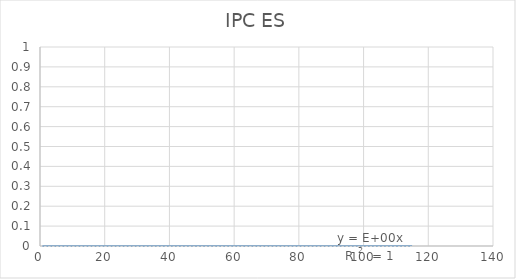
| Category | Series 0 |
|---|---|
| 1.0 | 99.81 |
| 2.0 | 99.95 |
| 3.0 | 100.72 |
| 4.0 | 100.55 |
| 5.0 | 100.61 |
| 6.0 | 100.79 |
| 7.0 | 100.63 |
| 8.0 | 100.4 |
| 9.0 | 100.2 |
| 10.0 | 99.46 |
| 11.0 | 99.06 |
| 12.0 | 100 |
| 13.0 | 100.44 |
| 14.0 | 100.57 |
| 15.0 | 100.89 |
| 16.0 | 100.71 |
| 17.0 | 100.5 |
| 18.0 | 100.96 |
| 19.0 | 100.98 |
| 20.0 | 100.81 |
| 21.0 | 101.11 |
| 22.0 | 101.78 |
| 23.0 | 102.24 |
| 24.0 | 102.13 |
| 25.0 | 102.77 |
| 26.0 | 102.96 |
| 27.0 | 103.63 |
| 28.0 | 106.71 |
| 29.0 | 107.23 |
| 30.0 | 107.29 |
| 31.0 | 107.57 |
| 32.0 | 107.69 |
| 33.0 | 107.4 |
| 34.0 | 107.32 |
| 35.0 | 107.48 |
| 36.0 | 107.29 |
| 37.0 | 107.65 |
| 38.0 | 108 |
| 39.0 | 108.16 |
| 40.0 | 108.83 |
| 41.0 | 108.53 |
| 42.0 | 107.94 |
| 43.0 | 107.61 |
| 44.0 | 107.8 |
| 45.0 | 108.24 |
| 46.0 | 108.34 |
| 47.0 | 108.18 |
| 48.0 | 108.13 |
| 49.0 | 108.59 |
| 50.0 | 109.05 |
| 51.0 | 109.54 |
| 52.0 | 108.85 |
| 53.0 | 108.69 |
| 54.0 | 108.91 |
| 55.0 | 108.78 |
| 56.0 | 108.87 |
| 57.0 | 109.06 |
| 58.0 | 108.91 |
| 59.0 | 109 |
| 60.0 | 108.99 |
| 61.0 | 109.51 |
| 62.0 | 109.72 |
| 63.0 | 109.99 |
| 64.0 | 109.47 |
| 65.0 | 109.72 |
| 66.0 | 110.16 |
| 67.0 | 110.77 |
| 68.0 | 111.04 |
| 69.0 | 110.92 |
| 70.0 | 110.96 |
| 71.0 | 110.41 |
| 72.0 | 109.5 |
| 73.0 | 108.69 |
| 74.0 | 108.57 |
| 75.0 | 109.1 |
| 76.0 | 109.11 |
| 77.0 | 109.33 |
| 78.0 | 109.24 |
| 79.0 | 109.16 |
| 80.0 | 108.82 |
| 81.0 | 108.41 |
| 82.0 | 110.77 |
| 83.0 | 110.69 |
| 84.0 | 110.61 |
| 85.0 | 110.67 |
| 86.0 | 110.37 |
| 87.0 | 110.32 |
| 88.0 | 110.05 |
| 89.0 | 110.13 |
| 90.0 | 110.24 |
| 91.0 | 110.12 |
| 92.0 | 109.85 |
| 93.0 | 109.51 |
| 94.0 | 109.79 |
| 95.0 | 109.78 |
| 96.0 | 109.58 |
| 97.0 | 110.39 |
| 98.0 | 110.69 |
| 99.0 | 110.92 |
| 100.0 | 111 |
| 101.0 | 111.19 |
| 102.0 | 111.26 |
| 103.0 | 111.24 |
| 104.0 | 111.1 |
| 105.0 | 111.22 |
| 106.0 | 111.36 |
| 107.0 | 111.62 |
| 108.0 | 111.81 |
| 109.0 | 111.96 |
| 110.0 | 112.05 |
| 111.0 | 111.93 |
| 112.0 | 111.97 |
| 113.0 | 112.11 |
| 114.0 | 112.26 |
| 115.0 | 112.42 |